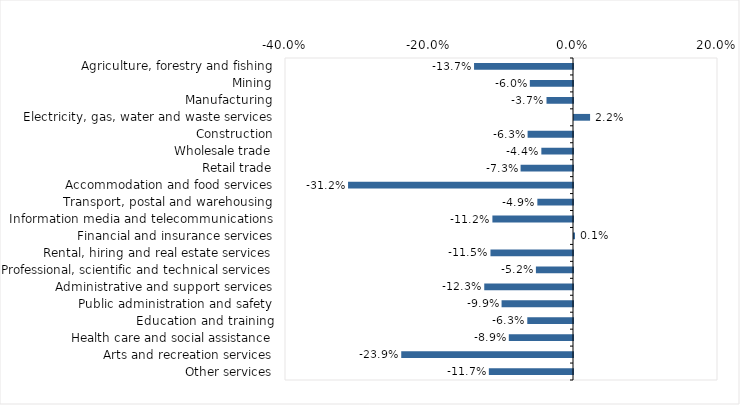
| Category | This week |
|---|---|
| Agriculture, forestry and fishing | -0.137 |
| Mining | -0.06 |
| Manufacturing | -0.037 |
| Electricity, gas, water and waste services | 0.022 |
| Construction | -0.063 |
| Wholesale trade | -0.044 |
| Retail trade | -0.073 |
| Accommodation and food services | -0.312 |
| Transport, postal and warehousing | -0.049 |
| Information media and telecommunications | -0.112 |
| Financial and insurance services | 0.001 |
| Rental, hiring and real estate services | -0.115 |
| Professional, scientific and technical services | -0.052 |
| Administrative and support services | -0.123 |
| Public administration and safety | -0.099 |
| Education and training | -0.063 |
| Health care and social assistance | -0.089 |
| Arts and recreation services | -0.239 |
| Other services | -0.117 |